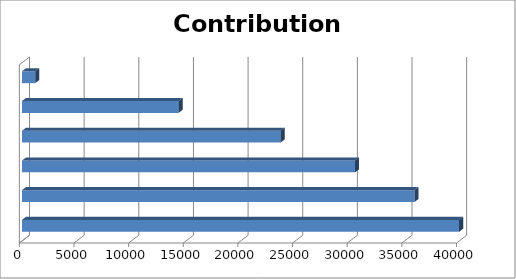
| Category | Contributions |
|---|---|
| 0 | 40000 |
| 1 | 35912 |
| 2 | 30478 |
| 3 | 23663 |
| 4 | 14332 |
| 5 | 1206 |